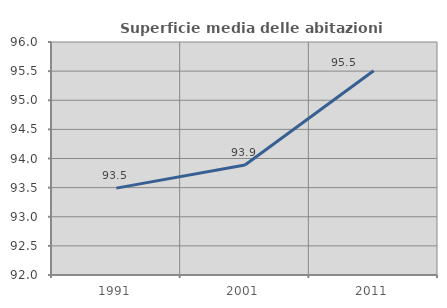
| Category | Superficie media delle abitazioni occupate |
|---|---|
| 1991.0 | 93.492 |
| 2001.0 | 93.888 |
| 2011.0 | 95.507 |